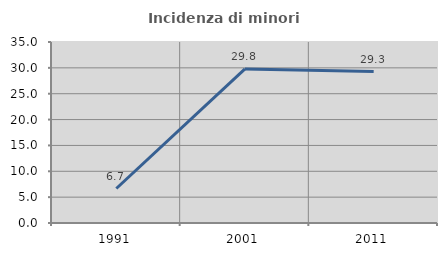
| Category | Incidenza di minori stranieri |
|---|---|
| 1991.0 | 6.667 |
| 2001.0 | 29.787 |
| 2011.0 | 29.288 |